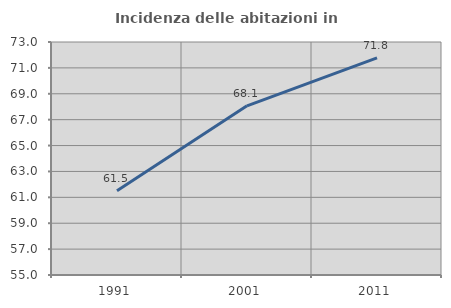
| Category | Incidenza delle abitazioni in proprietà  |
|---|---|
| 1991.0 | 61.512 |
| 2001.0 | 68.069 |
| 2011.0 | 71.772 |